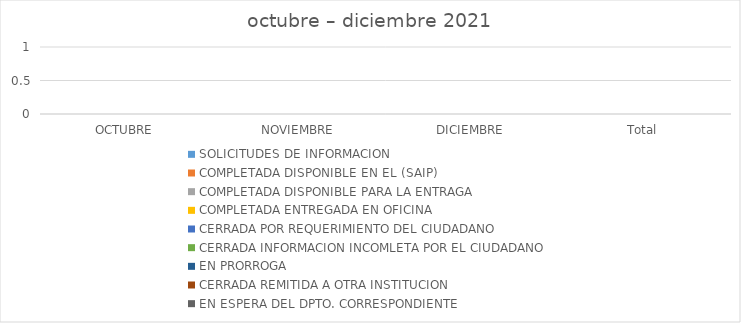
| Category | SOLICITUDES DE INFORMACION | COMPLETADA DISPONIBLE EN EL (SAIP) | COMPLETADA DISPONIBLE PARA LA ENTRAGA | COMPLETADA ENTREGADA EN OFICINA | CERRADA POR REQUERIMIENTO DEL CIUDADANO | CERRADA INFORMACION INCOMLETA POR EL CIUDADANO | EN PRORROGA | CERRADA REMITIDA A OTRA INSTITUCION | EN ESPERA DEL DPTO. CORRESPONDIENTE |
|---|---|---|---|---|---|---|---|---|---|
| OCTUBRE | 0 | 0 | 0 | 0 | 0 | 0 | 0 | 0 | 0 |
| NOVIEMBRE | 0 | 0 | 0 | 0 | 0 | 0 | 0 | 0 | 0 |
| DICIEMBRE | 0 | 0 | 0 | 0 | 0 | 0 | 0 | 0 | 0 |
| Total | 0 | 0 | 0 | 0 | 0 | 0 | 0 | 0 | 0 |